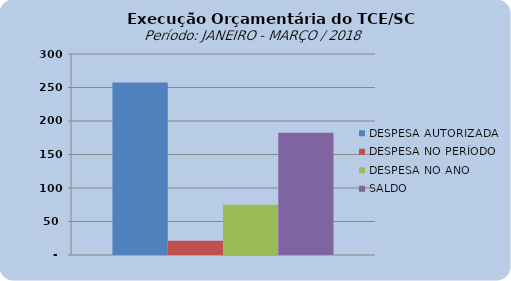
| Category | DESPESA AUTORIZADA | DESPESA NO PERÍODO | DESPESA NO ANO | SALDO |
|---|---|---|---|---|
| 0 | 257590351.39 | 21163443.39 | 75077937 | 182512414.39 |